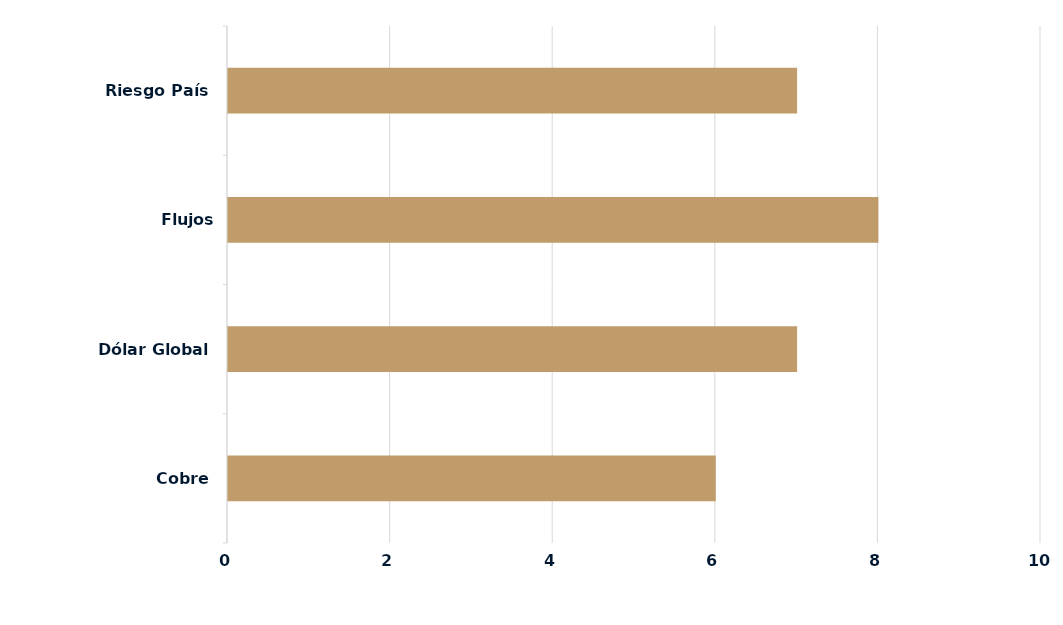
| Category | Series 0 |
|---|---|
| Cobre | 6 |
| Dólar Global | 7 |
| Flujos Locales/Extranjeros | 8 |
| Riesgo País | 7 |